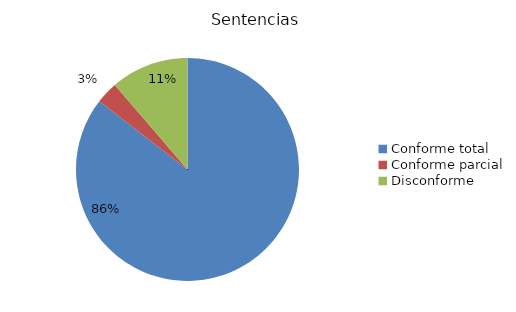
| Category | Sentencias |
|---|---|
| Conforme total | 53 |
| Conforme parcial | 2 |
| Disconforme | 7 |